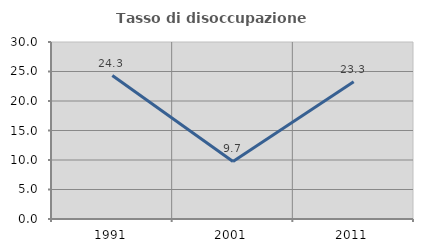
| Category | Tasso di disoccupazione giovanile  |
|---|---|
| 1991.0 | 24.314 |
| 2001.0 | 9.747 |
| 2011.0 | 23.266 |